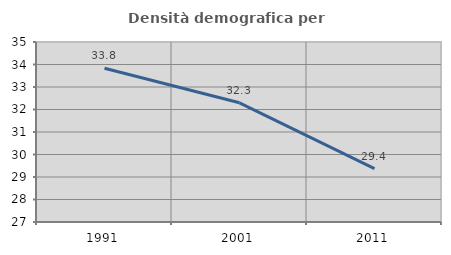
| Category | Densità demografica |
|---|---|
| 1991.0 | 33.83 |
| 2001.0 | 32.298 |
| 2011.0 | 29.375 |